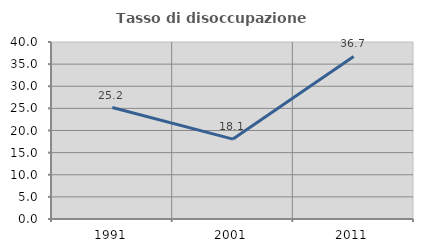
| Category | Tasso di disoccupazione giovanile  |
|---|---|
| 1991.0 | 25.185 |
| 2001.0 | 18.056 |
| 2011.0 | 36.735 |